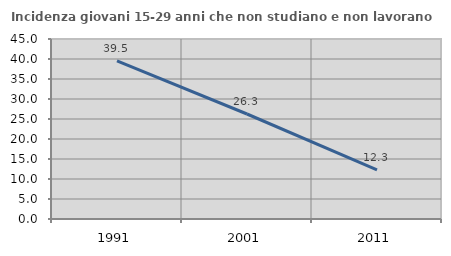
| Category | Incidenza giovani 15-29 anni che non studiano e non lavorano  |
|---|---|
| 1991.0 | 39.508 |
| 2001.0 | 26.25 |
| 2011.0 | 12.308 |